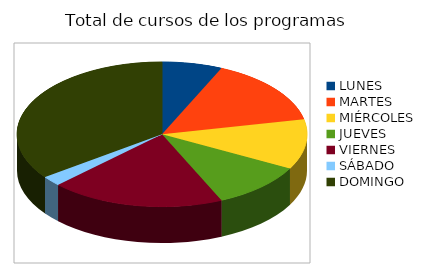
| Category | TOTAL |
|---|---|
| LUNES | 9 |
| MARTES | 20 |
| MIÉRCOLES | 15 |
| JUEVES | 14 |
| VIERNES | 26 |
| SÁBADO | 3 |
| DOMINGO | 47 |